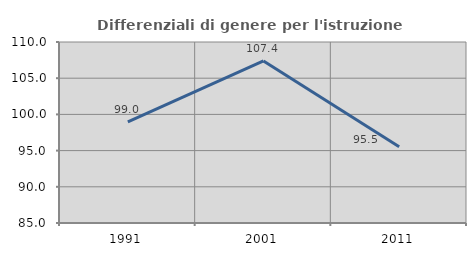
| Category | Differenziali di genere per l'istruzione superiore |
|---|---|
| 1991.0 | 98.981 |
| 2001.0 | 107.386 |
| 2011.0 | 95.536 |